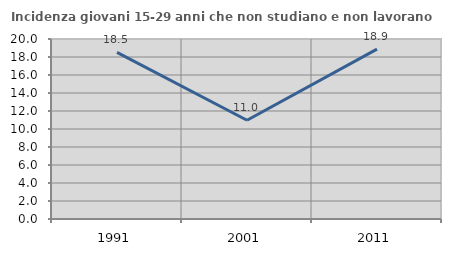
| Category | Incidenza giovani 15-29 anni che non studiano e non lavorano  |
|---|---|
| 1991.0 | 18.513 |
| 2001.0 | 10.976 |
| 2011.0 | 18.868 |